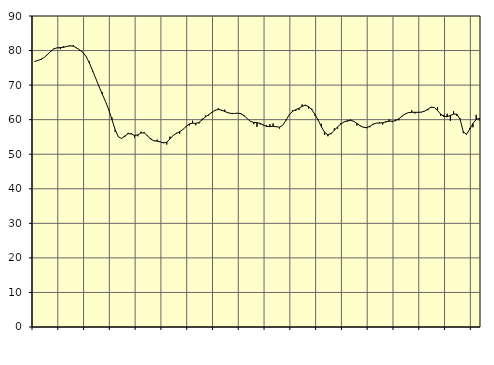
| Category | Piggar | Series 1 |
|---|---|---|
| nan | 76.9 | 76.83 |
| 87.0 | 77.1 | 77.13 |
| 87.0 | 77.3 | 77.5 |
| 87.0 | 78 | 78.01 |
| nan | 79 | 78.84 |
| 88.0 | 79.6 | 79.8 |
| 88.0 | 80.6 | 80.5 |
| 88.0 | 80.8 | 80.8 |
| nan | 80.4 | 80.86 |
| 89.0 | 81.3 | 80.95 |
| 89.0 | 81.1 | 81.18 |
| 89.0 | 81.5 | 81.36 |
| nan | 81.6 | 81.27 |
| 90.0 | 80.7 | 80.8 |
| 90.0 | 79.9 | 80.17 |
| 90.0 | 79.4 | 79.45 |
| nan | 78.3 | 78.25 |
| 91.0 | 76.8 | 76.39 |
| 91.0 | 73.9 | 74.16 |
| 91.0 | 71.9 | 71.86 |
| nan | 69.7 | 69.59 |
| 92.0 | 67.9 | 67.37 |
| 92.0 | 65.2 | 65.24 |
| 92.0 | 63.1 | 62.89 |
| nan | 60.6 | 60.02 |
| 93.0 | 56.5 | 57.1 |
| 93.0 | 55 | 55.03 |
| 93.0 | 54.5 | 54.56 |
| nan | 55 | 55.28 |
| 94.0 | 56.2 | 55.96 |
| 94.0 | 56.1 | 55.86 |
| 94.0 | 54.8 | 55.44 |
| nan | 55.2 | 55.59 |
| 95.0 | 56.5 | 56.15 |
| 95.0 | 56.4 | 56.19 |
| 95.0 | 55.5 | 55.36 |
| nan | 54.7 | 54.37 |
| 96.0 | 53.8 | 53.9 |
| 96.0 | 54.2 | 53.79 |
| 96.0 | 53.6 | 53.57 |
| nan | 53.4 | 53.26 |
| 97.0 | 52.8 | 53.49 |
| 97.0 | 55.1 | 54.42 |
| 97.0 | 55.5 | 55.43 |
| nan | 56.2 | 56.05 |
| 98.0 | 55.9 | 56.51 |
| 98.0 | 57.2 | 57.16 |
| 98.0 | 58.1 | 58 |
| nan | 58.3 | 58.78 |
| 99.0 | 59.7 | 58.99 |
| 99.0 | 58.4 | 58.94 |
| 99.0 | 58.9 | 59.2 |
| nan | 60.3 | 59.95 |
| 0.0 | 61.2 | 60.8 |
| 0.0 | 61.2 | 61.42 |
| 0.0 | 61.9 | 62.13 |
| nan | 62.8 | 62.73 |
| 1.0 | 63.3 | 62.94 |
| 1.0 | 62.5 | 62.77 |
| 1.0 | 62.9 | 62.37 |
| nan | 62.1 | 62 |
| 2.0 | 61.9 | 61.8 |
| 2.0 | 61.8 | 61.8 |
| 2.0 | 61.9 | 61.88 |
| nan | 61.9 | 61.73 |
| 3.0 | 61 | 61.17 |
| 3.0 | 60.3 | 60.26 |
| 3.0 | 59.4 | 59.5 |
| nan | 58.7 | 59.22 |
| 4.0 | 57.9 | 59.13 |
| 4.0 | 58.6 | 58.92 |
| 4.0 | 58.3 | 58.45 |
| nan | 58.4 | 58.02 |
| 5.0 | 58.7 | 57.99 |
| 5.0 | 58.9 | 58.09 |
| 5.0 | 58 | 57.95 |
| nan | 57.4 | 57.83 |
| 6.0 | 58.4 | 58.41 |
| 6.0 | 60 | 59.82 |
| 6.0 | 61.5 | 61.41 |
| nan | 62.7 | 62.4 |
| 7.0 | 62.5 | 62.87 |
| 7.0 | 62.8 | 63.3 |
| 7.0 | 64.4 | 63.85 |
| nan | 64.3 | 64.17 |
| 8.0 | 63.2 | 63.82 |
| 8.0 | 63.2 | 62.88 |
| 8.0 | 61.1 | 61.5 |
| nan | 60 | 59.83 |
| 9.0 | 58.8 | 57.93 |
| 9.0 | 55.6 | 56.31 |
| 9.0 | 55.2 | 55.62 |
| nan | 55.8 | 56.01 |
| 10.0 | 57.5 | 56.93 |
| 10.0 | 57.4 | 57.91 |
| 10.0 | 59 | 58.72 |
| nan | 59.4 | 59.34 |
| 11.0 | 59.4 | 59.68 |
| 11.0 | 60.1 | 59.77 |
| 11.0 | 59.6 | 59.54 |
| nan | 58.3 | 58.92 |
| 12.0 | 58.1 | 58.24 |
| 12.0 | 57.9 | 57.79 |
| 12.0 | 57.5 | 57.73 |
| nan | 57.8 | 58.07 |
| 13.0 | 58.8 | 58.66 |
| 13.0 | 59 | 59.01 |
| 13.0 | 59.3 | 59 |
| nan | 58.6 | 59.11 |
| 14.0 | 59.2 | 59.39 |
| 14.0 | 60.1 | 59.57 |
| 14.0 | 59.3 | 59.55 |
| nan | 60 | 59.7 |
| 15.0 | 59.8 | 60.27 |
| 15.0 | 61.1 | 61 |
| 15.0 | 61.6 | 61.64 |
| nan | 62 | 62.04 |
| 16.0 | 62.7 | 62.14 |
| 16.0 | 61.8 | 62.13 |
| 16.0 | 62 | 62.13 |
| nan | 62.1 | 62.19 |
| 17.0 | 62.4 | 62.47 |
| 17.0 | 62.7 | 63.02 |
| 17.0 | 63.7 | 63.59 |
| nan | 63.5 | 63.54 |
| 18.0 | 63.6 | 62.67 |
| 18.0 | 61.1 | 61.6 |
| 18.0 | 61.4 | 60.93 |
| nan | 61.7 | 60.87 |
| 19.0 | 59.7 | 61.23 |
| 19.0 | 62.4 | 61.6 |
| 19.0 | 61.1 | 61.61 |
| nan | 60.4 | 60.15 |
| 20.0 | 56.1 | 56.51 |
| 20.0 | 55.9 | 55.75 |
| 20.0 | 57.6 | 57.22 |
| nan | 57.8 | 58.88 |
| 21.0 | 61.4 | 60.07 |
| 21.0 | 59.8 | 60.38 |